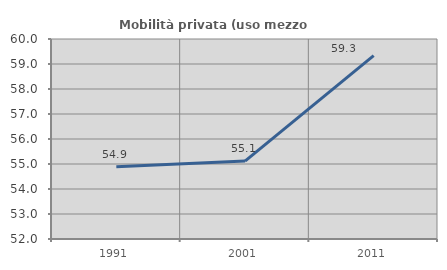
| Category | Mobilità privata (uso mezzo privato) |
|---|---|
| 1991.0 | 54.885 |
| 2001.0 | 55.115 |
| 2011.0 | 59.339 |